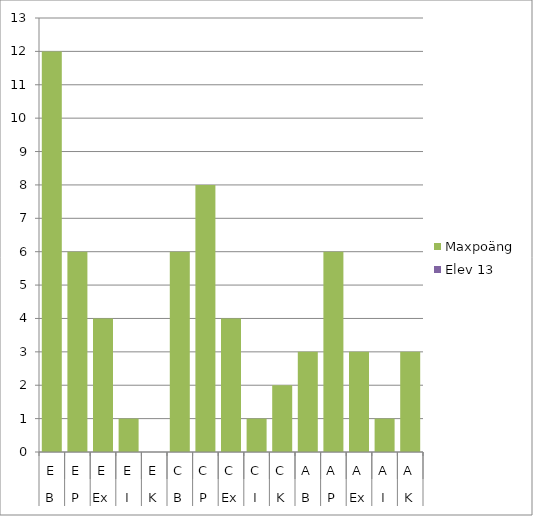
| Category | Maxpoäng | Elev 13 |
|---|---|---|
| 0 | 12 | 0 |
| 1 | 6 | 0 |
| 2 | 4 | 0 |
| 3 | 1 | 0 |
| 4 | 0 | 0 |
| 5 | 6 | 0 |
| 6 | 8 | 0 |
| 7 | 4 | 0 |
| 8 | 1 | 0 |
| 9 | 2 | 0 |
| 10 | 3 | 0 |
| 11 | 6 | 0 |
| 12 | 3 | 0 |
| 13 | 1 | 0 |
| 14 | 3 | 0 |